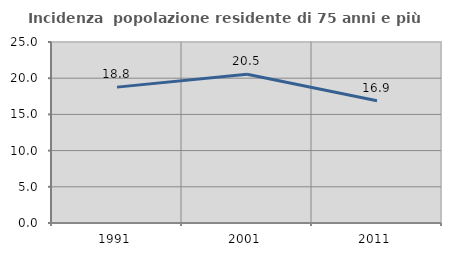
| Category | Incidenza  popolazione residente di 75 anni e più |
|---|---|
| 1991.0 | 18.768 |
| 2001.0 | 20.535 |
| 2011.0 | 16.89 |